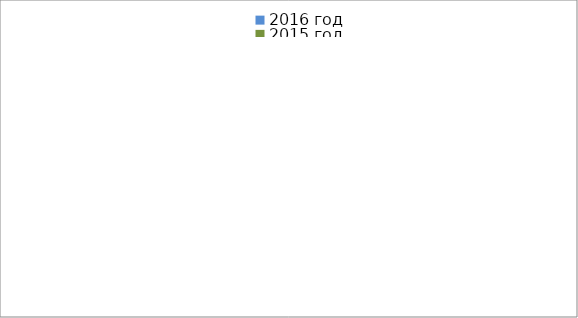
| Category | 2016 год | 2015 год |
|---|---|---|
|  - поджог | 18 | 5 |
|  - неосторожное обращение с огнём | 18 | 22 |
|  - НПТЭ электрооборудования | 3 | 3 |
|  - НПУ и Э печей | 18 | 20 |
|  - НПУ и Э транспортных средств | 9 | 25 |
|   -Шалость с огнем детей | 2 | 1 |
|  -НППБ при эксплуатации эл.приборов | 4 | 9 |
|  - курение | 2 | 8 |
| - прочие | 35 | 32 |
| - не установленные причины | 11 | 5 |